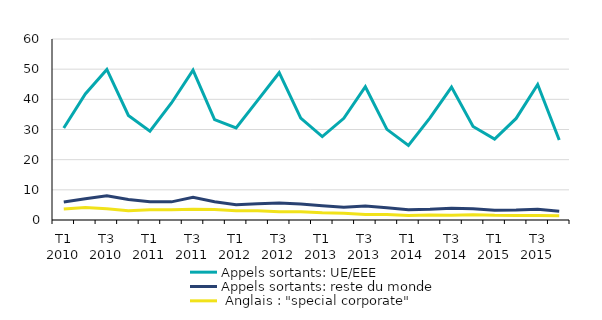
| Category | Appels sortants: UE/EEE | Appels sortants: reste du monde |  Anglais : "special corporate"
 |
|---|---|---|---|
| T1 2010 | 30.508 | 5.951 | 3.611 |
| T2 2010 | 41.764 | 7.028 | 4.125 |
| T3 2010 | 49.907 | 8.028 | 3.718 |
| T4 2010 | 34.666 | 6.797 | 3.031 |
| T1 2011 | 29.452 | 6.02 | 3.42 |
| T2 2011 | 38.792 | 6.01 | 3.424 |
| T3 2011 | 49.654 | 7.503 | 3.53 |
| T4 2011 | 33.3 | 6.034 | 3.452 |
| T1 2012 | 30.526 | 5.093 | 3.073 |
| T2 2012 | 39.654 | 5.384 | 3.058 |
| T3 2012 | 48.827 | 5.662 | 2.697 |
| T4 2012 | 33.799 | 5.329 | 2.717 |
| T1 2013 | 27.65 | 4.721 | 2.378 |
| T2 2013 | 33.711 | 4.208 | 2.245 |
| T3 2013 | 44.187 | 4.659 | 1.822 |
| T4 2013 | 30.051 | 4.056 | 1.796 |
| T1 2014 | 24.693 | 3.419 | 1.529 |
| T2 2014 | 33.838 | 3.536 | 1.646 |
| T3 2014 | 44.076 | 3.854 | 1.569 |
| T4 2014 | 31.02 | 3.743 | 1.768 |
| T1 2015 | 26.84 | 3.245 | 1.561 |
| T2 2015 | 33.673 | 3.292 | 1.522 |
| T3 2015 | 44.932 | 3.601 | 1.485 |
| T4 2015 | 26.527 | 2.913 | 1.443 |